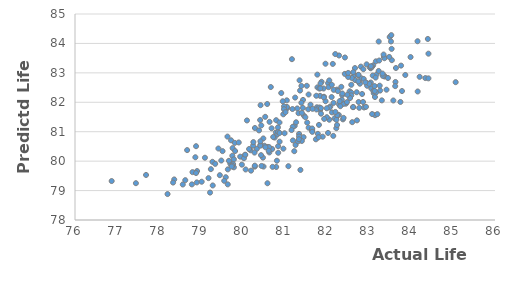
| Category | Predicted result from the model |
|---|---|
| 78.90059658559966 | 79.277 |
| 77.69154231204482 | 79.53 |
| 79.78287611781899 | 79.791 |
| 79.71565997356576 | 80.708 |
| 80.17769287189519 | 80.37 |
| 79.0937448277379 | 80.116 |
| 80.41857449699243 | 81.902 |
| 78.36236144353438 | 79.378 |
| 76.87314786016873 | 79.324 |
| 78.20365755821331 | 78.882 |
| 81.83552572438455 | 81.737 |
| 80.19186418625021 | 79.677 |
| 80.79057027475454 | 79.802 |
| 81.96609108293059 | 82.036 |
| 80.47455893276035 | 80.119 |
| 79.44842787246826 | 79.523 |
| 83.74825798839508 | 82.011 |
| 79.0163043928025 | 79.3 |
| 81.85674777995273 | 81.613 |
| 80.51235880231627 | 80.524 |
| 78.7830791148747 | 79.21 |
| 82.64536477127085 | 82.912 |
| 80.7833621194124 | 80.973 |
| 81.77251417904387 | 82.507 |
| 83.17927931407381 | 82.943 |
| 80.81550803114101 | 80.904 |
| 80.75384036293022 | 80.801 |
| 81.04710786076124 | 81.794 |
| 82.28101222253186 | 81.57 |
| 81.44992949418977 | 81.545 |
| 80.41688001667217 | 80.556 |
| 80.28077957723909 | 79.814 |
| 80.78945284387008 | 81.392 |
| 80.70410453202555 | 79.806 |
| 80.32956401047815 | 80.419 |
| 83.37639203566359 | 82.882 |
| 82.80597508324084 | 83.212 |
| 81.04281389241615 | 82.066 |
| 80.4088891598527 | 81.397 |
| 83.09836363734142 | 83.254 |
| 83.35522336084422 | 83.542 |
| 81.04653831129808 | 81.842 |
| 81.42891546141176 | 82.081 |
| 80.048164752666 | 80.207 |
| 80.62687252922592 | 80.296 |
| 81.78230538869559 | 80.927 |
| 79.69891396861871 | 79.911 |
| 82.0261289310183 | 82.651 |
| 81.29204056671551 | 81.791 |
| 82.11877506316955 | 81.657 |
| 81.56290323474886 | 81.137 |
| 82.53975301743053 | 82.373 |
| 81.75857422885544 | 81.83 |
| 82.75737106236741 | 82.691 |
| 82.66586395266762 | 83.163 |
| 84.40105336025798 | 84.152 |
| 83.23021309028923 | 83.065 |
| 83.64119436352024 | 83.165 |
| 82.28660188951739 | 83.59 |
| 83.11257756216763 | 82.31 |
| 80.41128485125859 | 80.525 |
| 83.05510104636701 | 82.472 |
| 83.76329881822844 | 83.246 |
| 80.48393896888743 | 80.771 |
| 78.88237953118522 | 80.508 |
| 80.95910365963022 | 81.592 |
| 79.93341529160534 | 80.152 |
| 82.8822932096045 | 81.823 |
| 83.10451704370773 | 82.385 |
| 80.97602626937068 | 81.863 |
| 79.48325274209013 | 80.02 |
| 80.14536324394653 | 80.412 |
| 82.23654609832533 | 82.43 |
| 81.38967957676002 | 81.982 |
| 81.17760197928479 | 81.771 |
| 81.44161813718269 | 80.815 |
| 80.97532415172125 | 81.766 |
| 82.81854098865766 | 82.815 |
| 81.34696118371731 | 82.746 |
| 82.75260094216324 | 82.009 |
| 81.3220516012806 | 81.63 |
| 83.26508303840441 | 82.399 |
| 82.57921369312716 | 82.328 |
| 81.33526979961802 | 80.925 |
| 82.28709214314419 | 81.93 |
| 83.36345377903112 | 82.882 |
| 84.34178888639426 | 82.823 |
| 83.45164412818164 | 82.826 |
| 82.94809824820354 | 82.655 |
| 82.66923611999408 | 82.756 |
| 80.86890510733875 | 81.313 |
| 81.73563052949913 | 80.742 |
| 79.41399978891963 | 80.429 |
| 83.41700159016442 | 82.428 |
| 82.2166357786859 | 81.467 |
| 83.25488790818328 | 82.564 |
| 81.23085306446171 | 81.198 |
| 81.74862079189064 | 81.756 |
| 82.74265153538538 | 82.922 |
| 81.25190850476869 | 80.549 |
| 82.95575153257519 | 82.561 |
| 81.51932047049293 | 82.56 |
| 82.05398633382849 | 82.744 |
| 80.83535817322138 | 80.993 |
| 81.83372138698792 | 82.22 |
| 83.14428834367854 | 81.562 |
| 80.02249000223226 | 80.1 |
| 82.94340196676286 | 83.289 |
| 81.87030684380251 | 82.696 |
| 83.16392773736952 | 83.391 |
| 82.0543528345295 | 81.407 |
| 80.09420527248646 | 81.383 |
| 81.77040372880346 | 82.94 |
| 82.78362373325199 | 82.631 |
| 81.91834505929485 | 82.469 |
| 83.07204184406723 | 83.207 |
| 83.3276808483473 | 82.898 |
| 82.59122366419727 | 82.828 |
| 81.1859952086745 | 81.168 |
| 84.4155882196834 | 83.652 |
| 81.89763707823813 | 80.832 |
| 83.7854818028842 | 82.382 |
| 81.8167499046737 | 82.468 |
| 82.87376032265944 | 82.792 |
| 83.49285254662877 | 84.218 |
| 83.19797844510276 | 81.597 |
| 83.04050924136574 | 83.156 |
| 82.70714692165276 | 82.341 |
| 82.19673450077269 | 83.638 |
| 83.0423611981527 | 82.672 |
| 81.16516106661007 | 83.465 |
| 82.17997084435652 | 81.454 |
| 81.55297773701247 | 81.763 |
| 80.63226503400973 | 81.335 |
| 80.96135177731033 | 80.424 |
| 81.64801968780304 | 81.06 |
| 82.07926890368635 | 81.858 |
| 83.54456485190444 | 83.431 |
| 81.18766746117956 | 80.704 |
| 80.69485947287068 | 80.412 |
| 80.05421718578691 | 80.219 |
| 83.13255330081302 | 82.552 |
| 83.01888068568556 | 83.185 |
| 78.6254945408933 | 79.354 |
| 80.57603919127301 | 81.942 |
| 81.01199620935857 | 81.664 |
| 78.90645365098517 | 79.663 |
| 80.28371952943417 | 81.126 |
| 79.80506934530189 | 80.621 |
| 79.63034732745724 | 80.834 |
| 82.34014955694482 | 82.524 |
| 80.28149906343587 | 79.847 |
| 81.9282864501162 | 82.188 |
| 81.1566417684259 | 81.057 |
| 80.83567148651842 | 80.508 |
| 82.71329372440088 | 81.386 |
| 82.15596098264722 | 81.978 |
| 83.14234506553943 | 82.179 |
| 82.44938158280323 | 81.952 |
| 82.76757613043735 | 81.812 |
| 81.5285233518225 | 81.31 |
| 81.99642211837617 | 81.493 |
| 80.58281510626357 | 79.249 |
| 80.4895549354562 | 79.816 |
| 79.7527674031935 | 80.443 |
| 83.07408686565061 | 81.6 |
| 81.3667410762264 | 79.702 |
| 82.221699125621 | 81.119 |
| 82.14940841602505 | 80.858 |
| 81.64469246793024 | 81.032 |
| 82.57847720294815 | 82.236 |
| 80.42945922710926 | 80.204 |
| 81.79943257969525 | 80.812 |
| 82.60028126801626 | 81.325 |
| 80.87115932127409 | 80.957 |
| 82.92862102290077 | 81.846 |
| 78.6699539262025 | 80.375 |
| 82.38764553256554 | 81.943 |
| 81.8082761077674 | 81.232 |
| 81.48423908971469 | 81.492 |
| 80.5286770561116 | 81.506 |
| 83.04919955310247 | 83.189 |
| 80.98969937065347 | 80.948 |
| 83.00816513479934 | 82.627 |
| 83.62995184643066 | 82.69 |
| 82.50336955735817 | 82.861 |
| 82.57827107209147 | 82.594 |
| 82.83553704034459 | 82.282 |
| 80.94623950830737 | 82.035 |
| 82.15956342665226 | 82.423 |
| 79.76466156505747 | 79.9 |
| 80.27461896625351 | 80.291 |
| 81.81958721939776 | 81.824 |
| 81.60749494046905 | 81.918 |
| 79.74574595114943 | 80.183 |
| 81.40003134628863 | 80.685 |
| 83.36832654522088 | 83.497 |
| 81.84581691792546 | 82.639 |
| 82.42415834968962 | 82.965 |
| 83.53880726400585 | 83.814 |
| 83.8642333608233 | 82.927 |
| 83.08940170449111 | 82.909 |
| 82.36148060319452 | 82.244 |
| 82.22433990869011 | 81.405 |
| 82.54896581158498 | 82.144 |
| 81.56159045175866 | 82.265 |
| 82.48393123306745 | 82.256 |
| 80.5923618452387 | 80.482 |
| 80.68169900476325 | 81.116 |
| 81.85528081794402 | 81.802 |
| 80.62194778491485 | 80.476 |
| 82.37979476176771 | 81.42 |
| 81.93269476889813 | 81.436 |
| 81.40039440138119 | 81.64 |
| 80.71957607297755 | 80.82 |
| 82.8578774569529 | 82.01 |
| 82.02463983459192 | 80.958 |
| 81.33361380355919 | 80.838 |
| 83.57950650138999 | 82.061 |
| 83.16867993129844 | 82.336 |
| 83.30547386698582 | 82.065 |
| 81.22063736939582 | 80.339 |
| 83.98958355402873 | 83.537 |
| 83.53119958353903 | 84.282 |
| 83.48099473608227 | 83.541 |
| 83.23086893625799 | 84.065 |
| 82.13817811575947 | 83.304 |
| 82.91318533611208 | 82.676 |
| 82.25906175039698 | 82.38 |
| 83.0443170599177 | 83.225 |
| 82.86501832711176 | 83.123 |
| 83.52326496007 | 84.067 |
| 82.42718582926612 | 83.522 |
| 80.6617678206447 | 82.518 |
| 80.41423761454955 | 80.676 |
| 81.74452253260012 | 82.222 |
| 82.62502715164783 | 83.024 |
| 82.7510170735117 | 82.932 |
| 82.05643737743827 | 81.821 |
| 81.6480181681258 | 81.109 |
| 82.7453607990766 | 82.712 |
| 82.24498669194772 | 81.564 |
| 83.34725358864594 | 83.623 |
| 83.24283701911345 | 83.419 |
| 81.3587615860535 | 82.399 |
| 81.8415381402294 | 82.474 |
| 82.35207959767489 | 82.083 |
| 81.31032703271907 | 80.672 |
| 81.24176045807293 | 82.159 |
| 83.13620278860522 | 82.384 |
| 81.33079744417891 | 80.745 |
| 79.7828152434964 | 80.062 |
| 79.81196844575418 | 80.344 |
| 77.45035332992191 | 79.251 |
| 78.79763046894972 | 79.627 |
| 78.8822887267853 | 79.596 |
| 78.86539827225427 | 80.132 |
| 81.65580097529164 | 81.777 |
| 79.27273496945439 | 79.978 |
| 81.92282024324325 | 82.167 |
| 79.51333181293003 | 80.341 |
| 78.5662547386842 | 79.206 |
| 78.33558202912192 | 79.272 |
| 79.23487391926267 | 79.728 |
| 80.38190074985538 | 81.045 |
| 79.89868722223602 | 80.635 |
| 80.06310036655407 | 79.717 |
| 79.66493924912322 | 80.011 |
| 79.74167979392847 | 79.849 |
| 80.83849481865691 | 80.285 |
| 79.33751977978503 | 79.908 |
| 80.24061874611323 | 80.526 |
| 79.63900747268656 | 79.72 |
| 79.17894138867753 | 79.423 |
| 79.58998861857835 | 79.453 |
| 80.44090962699772 | 79.837 |
| 80.80721136866337 | 80.014 |
| 79.21564106759735 | 78.932 |
| 82.3657017191256 | 82.299 |
| 79.63669776995702 | 79.211 |
| 79.27947527798555 | 79.174 |
| 79.55286309355746 | 79.331 |
| 80.53380108705738 | 80.472 |
| 80.61230221057082 | 80.352 |
| 80.24645653450895 | 80.647 |
| 79.9728996961085 | 79.88 |
| 79.72940736836038 | 79.817 |
| 83.62406123870117 | 82.549 |
| 82.19974495318141 | 81.672 |
| 82.62081204021113 | 81.834 |
| 83.15740481042799 | 82.839 |
| 84.41499698260569 | 82.813 |
| 81.99411941393318 | 81.797 |
| 82.47535518802096 | 82.005 |
| 82.39514488972591 | 81.47 |
| 80.83217747799483 | 81.146 |
| 80.87168877166144 | 80.662 |
| 82.03725849930962 | 82.514 |
| 82.31663102360352 | 81.867 |
| 84.20581320627109 | 82.865 |
| 82.24013563466221 | 81.228 |
| 82.300557240571 | 82.037 |
| 82.11063722264883 | 82.178 |
| 81.39052272435413 | 82.555 |
| 85.06352510311086 | 82.684 |
| 83.32264665020178 | 82.975 |
| 80.91085369714266 | 82.315 |
| 81.26399664168643 | 81.321 |
| 82.50424432991785 | 82.997 |
| 81.08068024360512 | 79.828 |
| 82.62235921587107 | 81.838 |
| 84.15538704211858 | 84.074 |
| 81.42521042585551 | 81.809 |
| 82.11407781697987 | 82.594 |
| 80.43545094792037 | 81.214 |
| 81.64904491215147 | 80.995 |
| 81.96422688028191 | 83.31 |
| 84.15934868159388 | 82.367 |